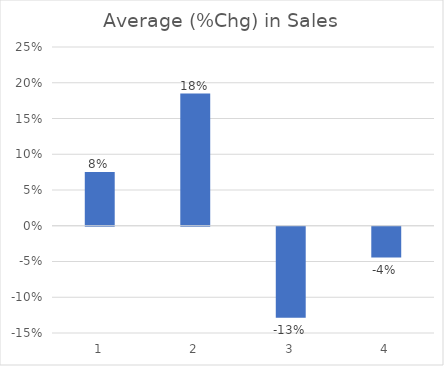
| Category | Average (%Chg) in Sales |
|---|---|
| 1.0 | 0.075 |
| 2.0 | 0.185 |
| 3.0 | -0.127 |
| 4.0 | -0.043 |